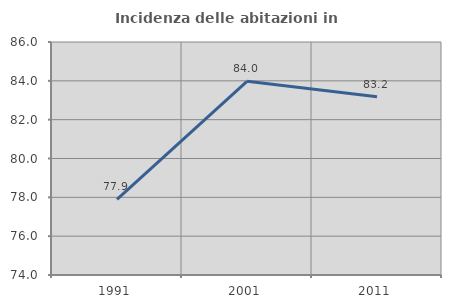
| Category | Incidenza delle abitazioni in proprietà  |
|---|---|
| 1991.0 | 77.893 |
| 2001.0 | 83.976 |
| 2011.0 | 83.18 |